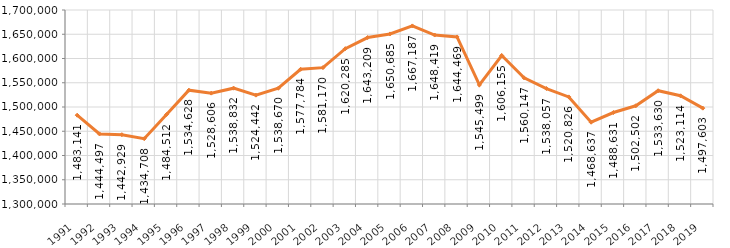
| Category | Series 0 |
|---|---|
| 1991 | 1483141.133 |
| 1992 | 1444497.4 |
| 1993 | 1442928.991 |
| 1994 | 1434708.138 |
| 1995 | 1484511.784 |
| 1996 | 1534627.603 |
| 1997 | 1528605.701 |
| 1998 | 1538831.904 |
| 1999 | 1524442.047 |
| 2000 | 1538669.664 |
| 2001 | 1577784.314 |
| 2002 | 1581170.468 |
| 2003 | 1620284.701 |
| 2004 | 1643208.957 |
| 2005 | 1650685.113 |
| 2006 | 1667186.897 |
| 2007 | 1648419.421 |
| 2008 | 1644469.05 |
| 2009 | 1545499.376 |
| 2010 | 1606154.589 |
| 2011 | 1560147.476 |
| 2012 | 1538056.891 |
| 2013 | 1520826.358 |
| 2014 | 1468637.205 |
| 2015 | 1488630.736 |
| 2016 | 1502501.812 |
| 2017 | 1533629.591 |
| 2018 | 1523114.078 |
| 2019 | 1497603.411 |